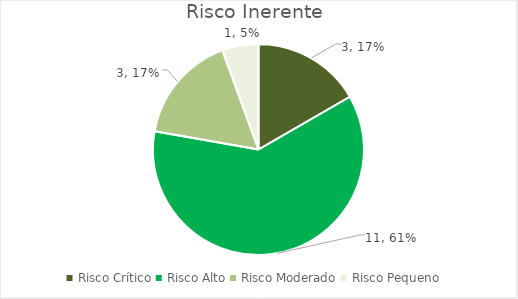
| Category | Series 0 |
|---|---|
| Risco Crítico | 3 |
| Risco Alto | 11 |
| Risco Moderado | 3 |
| Risco Pequeno | 1 |